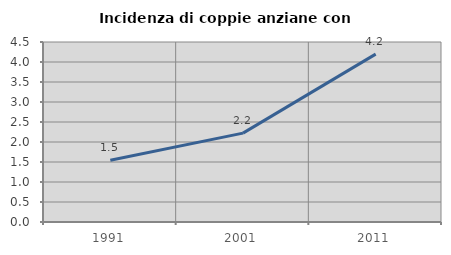
| Category | Incidenza di coppie anziane con figli |
|---|---|
| 1991.0 | 1.543 |
| 2001.0 | 2.222 |
| 2011.0 | 4.196 |